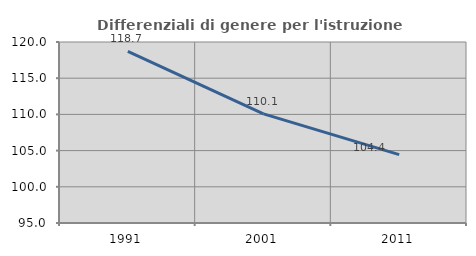
| Category | Differenziali di genere per l'istruzione superiore |
|---|---|
| 1991.0 | 118.707 |
| 2001.0 | 110.081 |
| 2011.0 | 104.45 |